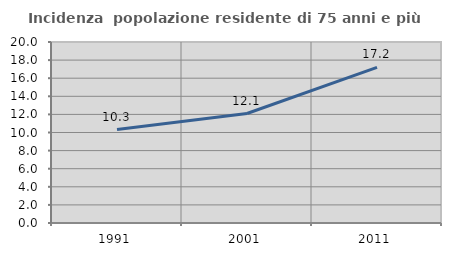
| Category | Incidenza  popolazione residente di 75 anni e più |
|---|---|
| 1991.0 | 10.321 |
| 2001.0 | 12.098 |
| 2011.0 | 17.195 |